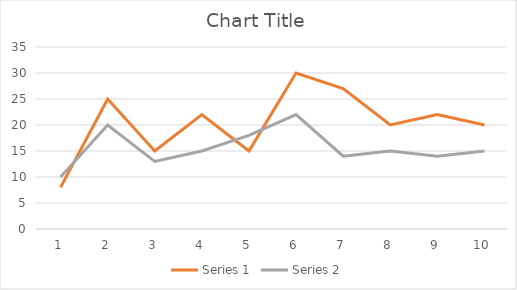
| Category | Series 1 | Series 2 |
|---|---|---|
| 0 | 8 | 10 |
| 1 | 25 | 20 |
| 2 | 15 | 13 |
| 3 | 22 | 15 |
| 4 | 15 | 18 |
| 5 | 30 | 22 |
| 6 | 27 | 14 |
| 7 | 20 | 15 |
| 8 | 22 | 14 |
| 9 | 20 | 15 |